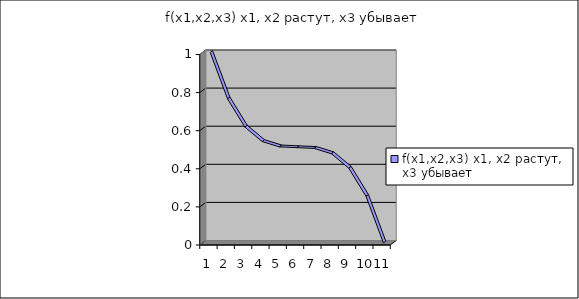
| Category | f(x1,x2,x3) x1, x2 растут, x3 убывает |
|---|---|
| 0 | 1 |
| 1 | 0.756 |
| 2 | 0.608 |
| 3 | 0.532 |
| 4 | 0.504 |
| 5 | 0.5 |
| 6 | 0.496 |
| 7 | 0.468 |
| 8 | 0.392 |
| 9 | 0.244 |
| 10 | 0 |